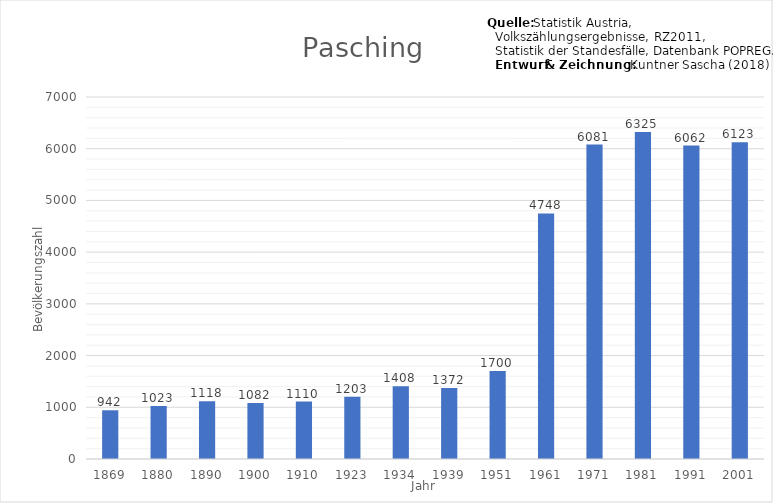
| Category | Bevölkerungszahl |
|---|---|
| 1869.0 | 942 |
| 1880.0 | 1023 |
| 1890.0 | 1118 |
| 1900.0 | 1082 |
| 1910.0 | 1110 |
| 1923.0 | 1203 |
| 1934.0 | 1408 |
| 1939.0 | 1372 |
| 1951.0 | 1700 |
| 1961.0 | 4748 |
| 1971.0 | 6081 |
| 1981.0 | 6325 |
| 1991.0 | 6062 |
| 2001.0 | 6123 |